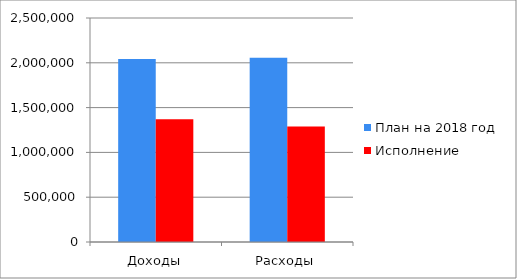
| Category | План на 2018 год | Исполнение |
|---|---|---|
| Доходы | 2042480 | 1369581 |
| Расходы | 2056009 | 1288977 |